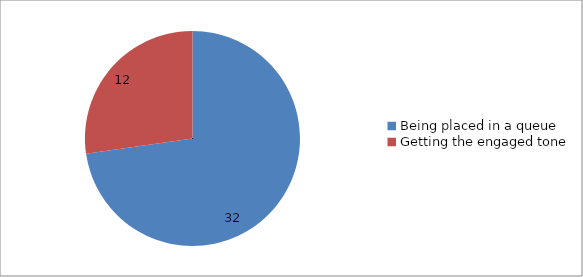
| Category | Series 0 |
|---|---|
| Being placed in a queue | 32 |
| Getting the engaged tone | 12 |